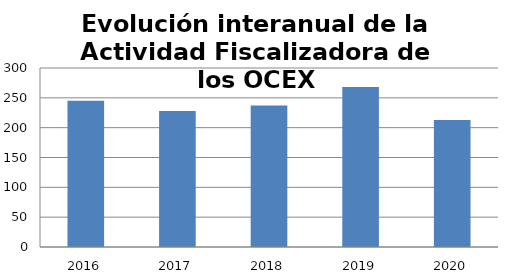
| Category | Series 0 |
|---|---|
| 2016.0 | 245 |
| 2017.0 | 228 |
| 2018.0 | 237 |
| 2019.0 | 268 |
| 2020.0 | 213 |